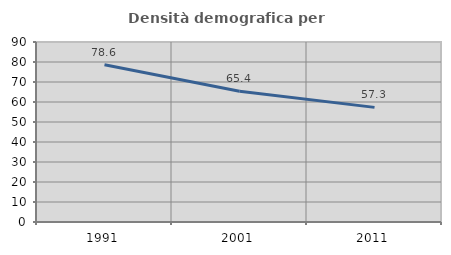
| Category | Densità demografica |
|---|---|
| 1991.0 | 78.623 |
| 2001.0 | 65.423 |
| 2011.0 | 57.317 |